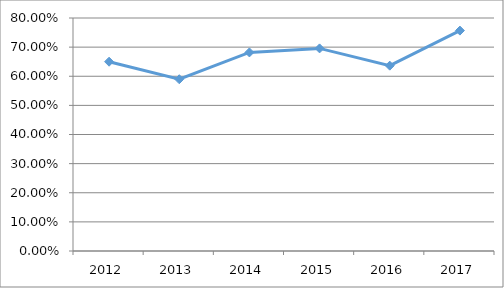
| Category | ARCO-I4O01 |
|---|---|
| 2012.0 | 0.65 |
| 2013.0 | 0.59 |
| 2014.0 | 0.682 |
| 2015.0 | 0.696 |
| 2016.0 | 0.636 |
| 2017.0 | 0.757 |